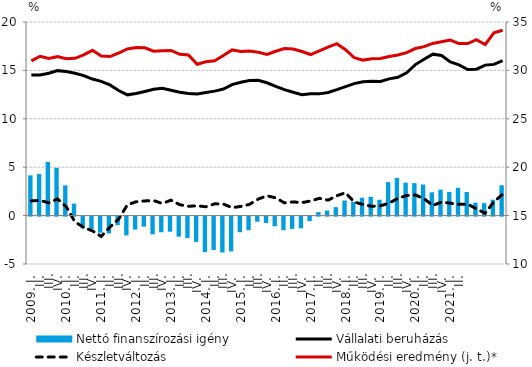
| Category | Nettó finanszírozási igény |
|---|---|
| 2009. I. | 4.156 |
|          II. | 4.29 |
|          III. | 5.545 |
|          IV. | 4.935 |
| 2010. I. | 3.13 |
|          II. | 1.236 |
|          III. | -1.214 |
|          IV. | -1.287 |
| 2011. I. | -1.668 |
|          II. | -1.744 |
|          III. | -0.885 |
|          IV. | -1.945 |
| 2012. I. | -1.349 |
|          II. | -1.042 |
|          III. | -1.828 |
|          IV. | -1.616 |
| 2013. I. | -1.564 |
| II. | -2.071 |
|          III. | -2.225 |
| IV. | -2.613 |
| 2014. I. | -3.675 |
| II. | -3.449 |
|          III. | -3.702 |
| IV. | -3.595 |
| 2015. I. | -1.617 |
| II. | -1.403 |
|          III. | -0.53 |
| IV. | -0.662 |
| 2016. I. | -0.995 |
| II. | -1.401 |
|          III. | -1.273 |
| IV. | -1.209 |
| 2017. I. | -0.47 |
| II. | 0.358 |
|          III. | 0.522 |
| IV. | 0.871 |
| 2018. I. | 1.565 |
| II. | 1.436 |
|          III. | 1.847 |
| IV. | 1.939 |
| 2019. I. | 1.638 |
| II. | 3.457 |
|          III. | 3.895 |
| IV. | 3.405 |
| 2020. I. | 3.358 |
| II. | 3.212 |
|          III. | 2.404 |
| IV. | 2.678 |
| 2021. I. | 2.438 |
| II. | 2.874 |